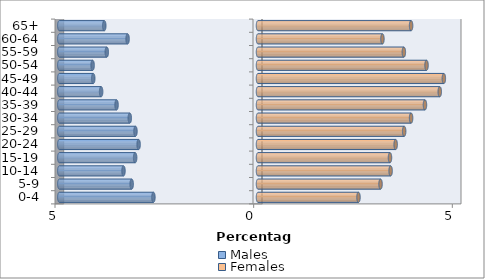
| Category | Males | Females |
|---|---|---|
| 0-4 | -2.632 | 2.529 |
| 5-9 | -3.179 | 3.084 |
| 10-14 | -3.385 | 3.338 |
| 15-19 | -3.092 | 3.322 |
| 20-24 | -3.005 | 3.465 |
| 25-29 | -3.084 | 3.679 |
| 30-34 | -3.227 | 3.853 |
| 35-39 | -3.56 | 4.202 |
| 40-44 | -3.948 | 4.575 |
| 45-49 | -4.147 | 4.678 |
| 50-54 | -4.162 | 4.242 |
| 55-59 | -3.806 | 3.671 |
| 60-64 | -3.282 | 3.132 |
| 65+ | -3.869 | 3.853 |